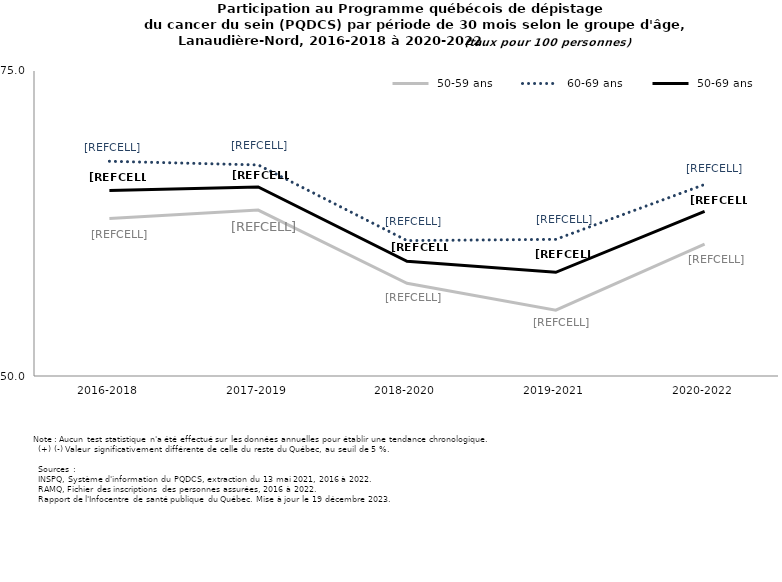
| Category |  50-59 ans |  60-69 ans |  50-69 ans |
|---|---|---|---|
| 2016-2018 | 62.9 | 67.6 | 65.2 |
| 2017-2019 | 63.6 | 67.3 | 65.5 |
| 2018-2020 | 57.6 | 61.1 | 59.4 |
| 2019-2021 | 55.4 | 61.2 | 58.5 |
| 2020-2022 | 60.8 | 65.7 | 63.5 |